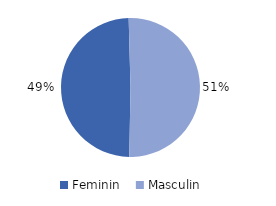
| Category | Series 0 |
|---|---|
| Feminin | 49.3 |
| Masculin  | 50.7 |